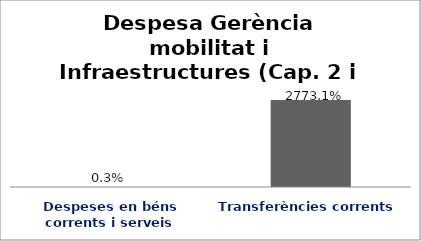
| Category | Series 0 |
|---|---|
| Despeses en béns corrents i serveis | 0.003 |
| Transferències corrents | 27.731 |